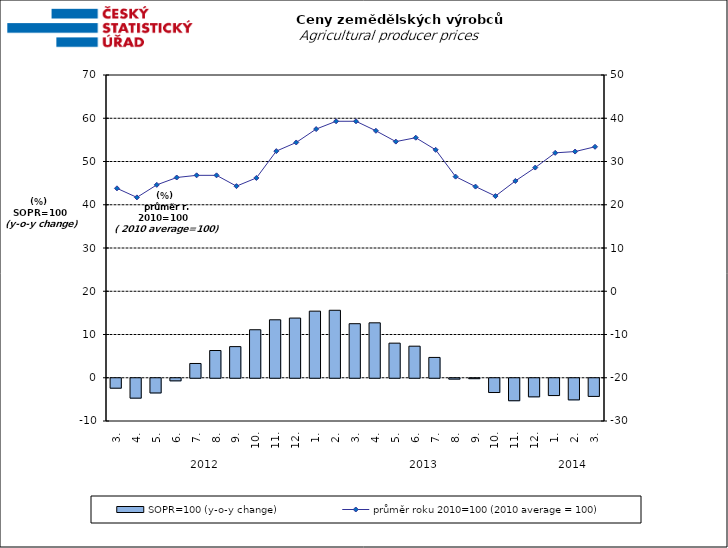
| Category | SOPR=100 (y-o-y change)   |
|---|---|
| 0 | -2.3 |
| 1 | -4.6 |
| 2 | -3.4 |
| 3 | -0.6 |
| 4 | 3.3 |
| 5 | 6.3 |
| 6 | 7.2 |
| 7 | 11.1 |
| 8 | 13.4 |
| 9 | 13.8 |
| 10 | 15.4 |
| 11 | 15.6 |
| 12 | 12.5 |
| 13 | 12.7 |
| 14 | 8 |
| 15 | 7.3 |
| 16 | 4.7 |
| 17 | -0.2 |
| 18 | -0.1 |
| 19 | -3.3 |
| 20 | -5.2 |
| 21 | -4.3 |
| 22 | -4 |
| 23 | -5 |
| 24 | -4.2 |